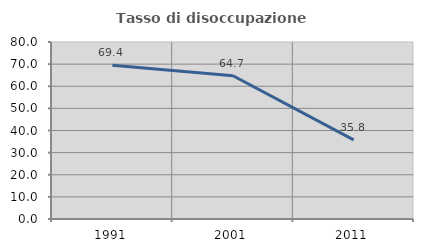
| Category | Tasso di disoccupazione giovanile  |
|---|---|
| 1991.0 | 69.444 |
| 2001.0 | 64.74 |
| 2011.0 | 35.754 |